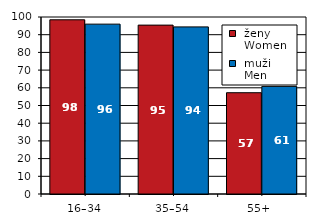
| Category |  ženy 
 Women |  muži 
 Men |
|---|---|---|
| 16–34 | 98.422 | 95.974 |
| 35–54 | 95.417 | 94.41 |
| 55+  | 57.224 | 60.803 |